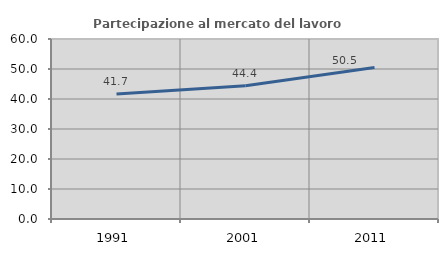
| Category | Partecipazione al mercato del lavoro  femminile |
|---|---|
| 1991.0 | 41.676 |
| 2001.0 | 44.437 |
| 2011.0 | 50.482 |